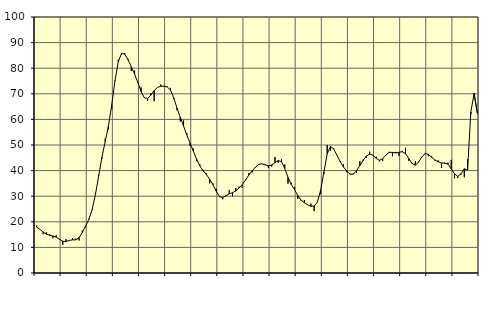
| Category | Piggar | Series 1 |
|---|---|---|
| nan | 18.5 | 17.9 |
| 87.0 | 17.1 | 17.07 |
| 87.0 | 15.2 | 16.02 |
| 87.0 | 15.9 | 15.16 |
| nan | 15.1 | 14.74 |
| 88.0 | 13.6 | 14.48 |
| 88.0 | 14.7 | 14 |
| 88.0 | 13 | 13.2 |
| nan | 11 | 12.41 |
| 89.0 | 13.2 | 12.24 |
| 89.0 | 12.7 | 12.73 |
| 89.0 | 13.6 | 12.94 |
| nan | 13.4 | 12.93 |
| 90.0 | 12.7 | 13.82 |
| 90.0 | 16.6 | 15.82 |
| 90.0 | 17.9 | 18.33 |
| nan | 21.2 | 20.95 |
| 91.0 | 24.6 | 24.78 |
| 91.0 | 30.7 | 30.62 |
| 91.0 | 38.4 | 37.9 |
| nan | 44.7 | 45.17 |
| 92.0 | 52.5 | 51.31 |
| 92.0 | 56.1 | 57.49 |
| 92.0 | 64.1 | 65.64 |
| nan | 75.3 | 75.07 |
| 93.0 | 83.3 | 82.49 |
| 93.0 | 85.2 | 85.81 |
| 93.0 | 85.9 | 85.46 |
| nan | 83.6 | 83.3 |
| 94.0 | 78.9 | 80.58 |
| 94.0 | 79.1 | 77.7 |
| 94.0 | 74.3 | 74.43 |
| nan | 72.5 | 70.84 |
| 95.0 | 68.6 | 68.44 |
| 95.0 | 67.3 | 68.19 |
| 95.0 | 70.2 | 69.52 |
| nan | 67.1 | 71.3 |
| 96.0 | 72.5 | 72.5 |
| 96.0 | 73.6 | 72.93 |
| 96.0 | 72.8 | 72.99 |
| nan | 72.9 | 72.68 |
| 97.0 | 72.3 | 71.45 |
| 97.0 | 68 | 68.41 |
| 97.0 | 63.6 | 64.45 |
| nan | 59.2 | 60.84 |
| 98.0 | 59.6 | 57.4 |
| 98.0 | 54.6 | 53.92 |
| 98.0 | 49.7 | 50.76 |
| nan | 48.6 | 47.58 |
| 99.0 | 43.7 | 44.48 |
| 99.0 | 42.4 | 41.83 |
| 99.0 | 40.3 | 39.93 |
| nan | 38.9 | 38.46 |
| 0.0 | 35 | 36.65 |
| 0.0 | 35 | 34.51 |
| 0.0 | 32.9 | 31.99 |
| nan | 29.7 | 29.83 |
| 1.0 | 28.8 | 29.45 |
| 1.0 | 30 | 30.26 |
| 1.0 | 32.4 | 30.92 |
| nan | 29.9 | 31.35 |
| 2.0 | 33.2 | 32.09 |
| 2.0 | 33.7 | 33.19 |
| 2.0 | 33.3 | 34.56 |
| nan | 36.5 | 36.28 |
| 3.0 | 39 | 38.24 |
| 3.0 | 39.3 | 39.9 |
| 3.0 | 41.1 | 41.29 |
| nan | 42.6 | 42.4 |
| 4.0 | 42.6 | 42.67 |
| 4.0 | 42.5 | 42.22 |
| 4.0 | 41 | 41.86 |
| nan | 41.6 | 42.21 |
| 5.0 | 45.3 | 43.07 |
| 5.0 | 43.1 | 43.94 |
| 5.0 | 44.4 | 43.48 |
| nan | 42.4 | 40.83 |
| 6.0 | 34.9 | 37.36 |
| 6.0 | 35.3 | 34.61 |
| 6.0 | 33.6 | 32.54 |
| nan | 29 | 30.3 |
| 7.0 | 28.1 | 28.4 |
| 7.0 | 28.5 | 27.44 |
| 7.0 | 26.6 | 26.66 |
| nan | 27.1 | 26.05 |
| 8.0 | 24.2 | 26.13 |
| 8.0 | 27.7 | 27.72 |
| 8.0 | 30.8 | 32.32 |
| nan | 38.8 | 39.52 |
| 9.0 | 50 | 46.51 |
| 9.0 | 47.8 | 49.43 |
| 9.0 | 48.7 | 48.46 |
| nan | 45.9 | 45.98 |
| 10.0 | 43.7 | 43.47 |
| 10.0 | 42.5 | 41.37 |
| 10.0 | 39.4 | 39.8 |
| nan | 38.5 | 38.65 |
| 11.0 | 38.9 | 38.6 |
| 11.0 | 39.1 | 39.99 |
| 11.0 | 43.7 | 41.96 |
| nan | 44.3 | 43.97 |
| 12.0 | 44.9 | 45.66 |
| 12.0 | 47.4 | 46.39 |
| 12.0 | 46.1 | 46.05 |
| nan | 45.4 | 44.8 |
| 13.0 | 43.6 | 44 |
| 13.0 | 43.8 | 44.66 |
| 13.0 | 46.1 | 46.06 |
| nan | 47.3 | 47.12 |
| 14.0 | 45.6 | 47.12 |
| 14.0 | 47.3 | 46.88 |
| 14.0 | 45.8 | 47.17 |
| nan | 47.7 | 47.38 |
| 15.0 | 48.9 | 46.59 |
| 15.0 | 43.8 | 44.71 |
| 15.0 | 43 | 42.79 |
| nan | 43.7 | 42.12 |
| 16.0 | 43.1 | 43.31 |
| 16.0 | 45.2 | 45.33 |
| 16.0 | 46.9 | 46.65 |
| nan | 45.6 | 46.34 |
| 17.0 | 45.6 | 45.19 |
| 17.0 | 43.9 | 44.15 |
| 17.0 | 44 | 43.44 |
| nan | 41 | 42.99 |
| 18.0 | 42.6 | 42.98 |
| 18.0 | 43.1 | 42.47 |
| 18.0 | 44.2 | 40.7 |
| nan | 37 | 38.77 |
| 19.0 | 37.1 | 37.76 |
| 19.0 | 38.4 | 38.75 |
| 19.0 | 37.4 | 40.7 |
| nan | 44.4 | 40.2 |
| 20.0 | 62 | 62.9 |
| 20.0 | 70.3 | 70.07 |
| 20.0 | 62.3 | 62.44 |